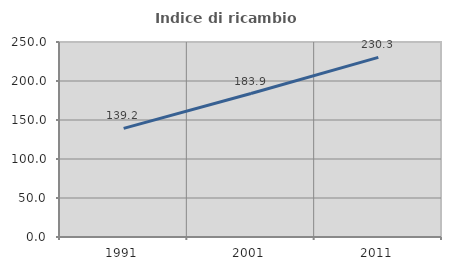
| Category | Indice di ricambio occupazionale  |
|---|---|
| 1991.0 | 139.195 |
| 2001.0 | 183.943 |
| 2011.0 | 230.279 |